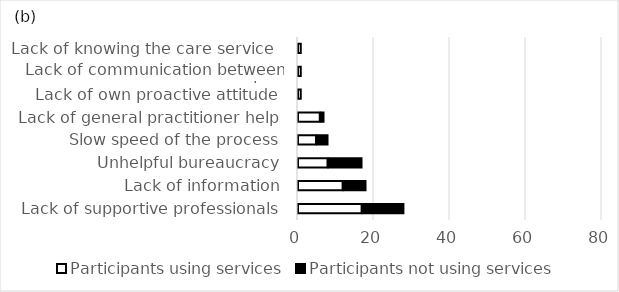
| Category | Participants using services | Participants not using services |
|---|---|---|
| Lack of supportive professionals | 17 | 11 |
| Lack of information | 12 | 6 |
| Unhelpful bureaucracy | 8 | 9 |
| Slow speed of the process | 5 | 3 |
| Lack of general practitioner help | 6 | 1 |
| Lack of own proactive attitude | 1 | 0 |
| Lack of communication between services | 1 | 0 |
| Lack of knowing the care service  | 1 | 0 |